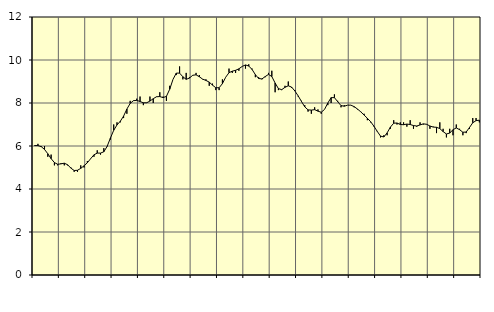
| Category | Piggar | Series 1 |
|---|---|---|
| nan | 6 | 6.02 |
| 87.0 | 6.1 | 6.02 |
| 87.0 | 6 | 5.97 |
| 87.0 | 6 | 5.84 |
| nan | 5.5 | 5.64 |
| 88.0 | 5.6 | 5.41 |
| 88.0 | 5.1 | 5.23 |
| 88.0 | 5.1 | 5.15 |
| nan | 5.2 | 5.17 |
| 89.0 | 5.1 | 5.2 |
| 89.0 | 5.1 | 5.13 |
| 89.0 | 5 | 4.97 |
| nan | 4.8 | 4.86 |
| 90.0 | 4.8 | 4.87 |
| 90.0 | 5.1 | 4.96 |
| 90.0 | 5 | 5.08 |
| nan | 5.3 | 5.22 |
| 91.0 | 5.4 | 5.41 |
| 91.0 | 5.5 | 5.59 |
| 91.0 | 5.8 | 5.67 |
| nan | 5.6 | 5.67 |
| 92.0 | 5.9 | 5.73 |
| 92.0 | 6 | 5.98 |
| 92.0 | 6.3 | 6.37 |
| nan | 7 | 6.73 |
| 93.0 | 7.1 | 6.98 |
| 93.0 | 7.1 | 7.15 |
| 93.0 | 7.3 | 7.39 |
| nan | 7.5 | 7.72 |
| 94.0 | 8.1 | 7.98 |
| 94.0 | 8.1 | 8.11 |
| 94.0 | 8.2 | 8.12 |
| nan | 8.3 | 8.07 |
| 95.0 | 7.9 | 8.01 |
| 95.0 | 8 | 8.01 |
| 95.0 | 8.3 | 8.09 |
| nan | 8 | 8.2 |
| 96.0 | 8.3 | 8.29 |
| 96.0 | 8.5 | 8.3 |
| 96.0 | 8.3 | 8.25 |
| nan | 8.1 | 8.31 |
| 97.0 | 8.8 | 8.64 |
| 97.0 | 9.1 | 9.1 |
| 97.0 | 9.3 | 9.39 |
| nan | 9.7 | 9.39 |
| 98.0 | 9.1 | 9.22 |
| 98.0 | 9.4 | 9.1 |
| 98.0 | 9.2 | 9.16 |
| nan | 9.3 | 9.29 |
| 99.0 | 9.4 | 9.31 |
| 99.0 | 9.3 | 9.22 |
| 99.0 | 9.1 | 9.11 |
| nan | 9.1 | 9.05 |
| 0.0 | 8.8 | 8.97 |
| 0.0 | 8.9 | 8.83 |
| 0.0 | 8.6 | 8.71 |
| nan | 8.6 | 8.71 |
| 1.0 | 9.1 | 8.9 |
| 1.0 | 9.2 | 9.2 |
| 1.0 | 9.6 | 9.41 |
| nan | 9.4 | 9.48 |
| 2.0 | 9.4 | 9.52 |
| 2.0 | 9.5 | 9.59 |
| 2.0 | 9.7 | 9.7 |
| nan | 9.6 | 9.77 |
| 3.0 | 9.8 | 9.72 |
| 3.0 | 9.6 | 9.56 |
| 3.0 | 9.2 | 9.32 |
| nan | 9.2 | 9.14 |
| 4.0 | 9.1 | 9.12 |
| 4.0 | 9.2 | 9.23 |
| 4.0 | 9.4 | 9.33 |
| nan | 9.5 | 9.23 |
| 5.0 | 8.5 | 8.93 |
| 5.0 | 8.6 | 8.67 |
| 5.0 | 8.6 | 8.62 |
| nan | 8.8 | 8.73 |
| 6.0 | 9 | 8.8 |
| 6.0 | 8.7 | 8.74 |
| 6.0 | 8.6 | 8.56 |
| nan | 8.3 | 8.33 |
| 7.0 | 8.1 | 8.07 |
| 7.0 | 7.9 | 7.82 |
| 7.0 | 7.6 | 7.68 |
| nan | 7.5 | 7.67 |
| 8.0 | 7.8 | 7.69 |
| 8.0 | 7.7 | 7.62 |
| 8.0 | 7.5 | 7.57 |
| nan | 7.7 | 7.7 |
| 9.0 | 7.9 | 8 |
| 9.0 | 8 | 8.25 |
| 9.0 | 8.4 | 8.25 |
| nan | 8.1 | 8.06 |
| 10.0 | 7.8 | 7.88 |
| 10.0 | 7.9 | 7.85 |
| 10.0 | 7.9 | 7.9 |
| nan | 7.9 | 7.9 |
| 11.0 | 7.8 | 7.83 |
| 11.0 | 7.7 | 7.72 |
| 11.0 | 7.6 | 7.59 |
| nan | 7.5 | 7.44 |
| 12.0 | 7.2 | 7.29 |
| 12.0 | 7.1 | 7.13 |
| 12.0 | 6.9 | 6.92 |
| nan | 6.7 | 6.68 |
| 13.0 | 6.4 | 6.46 |
| 13.0 | 6.5 | 6.42 |
| 13.0 | 6.5 | 6.61 |
| nan | 6.8 | 6.88 |
| 14.0 | 7.2 | 7.06 |
| 14.0 | 7 | 7.07 |
| 14.0 | 7.1 | 7 |
| nan | 7.1 | 6.99 |
| 15.0 | 6.9 | 7.02 |
| 15.0 | 7.2 | 7 |
| 15.0 | 6.8 | 6.95 |
| nan | 6.9 | 6.93 |
| 16.0 | 7.1 | 6.98 |
| 16.0 | 7 | 7.03 |
| 16.0 | 7 | 7.01 |
| nan | 6.8 | 6.93 |
| 17.0 | 6.9 | 6.88 |
| 17.0 | 6.6 | 6.87 |
| 17.0 | 7.1 | 6.81 |
| nan | 6.8 | 6.67 |
| 18.0 | 6.4 | 6.56 |
| 18.0 | 6.8 | 6.6 |
| 18.0 | 6.5 | 6.76 |
| nan | 7 | 6.84 |
| 19.0 | 6.8 | 6.76 |
| 19.0 | 6.5 | 6.64 |
| 19.0 | 6.6 | 6.65 |
| nan | 6.8 | 6.86 |
| 20.0 | 7.3 | 7.08 |
| 20.0 | 7.3 | 7.18 |
| 20.0 | 7.1 | 7.2 |